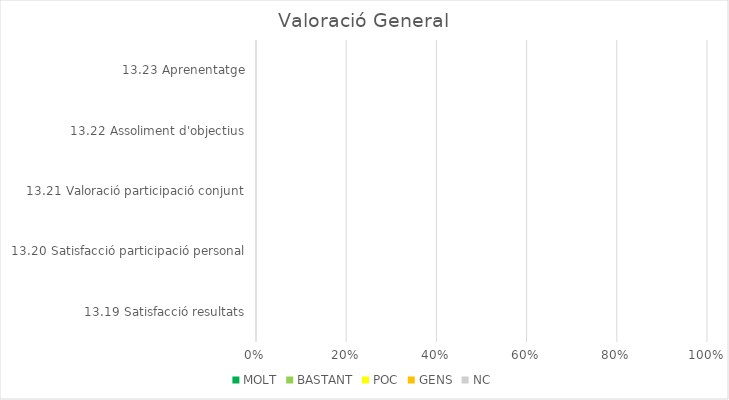
| Category | MOLT | BASTANT | POC | GENS | NC |
|---|---|---|---|---|---|
| 13.19 Satisfacció resultats | 0 | 0 | 0 | 0 | 0 |
| 13.20 Satisfacció participació personal | 0 | 0 | 0 | 0 | 0 |
| 13.21 Valoració participació conjunt | 0 | 0 | 0 | 0 | 0 |
| 13.22 Assoliment d'objectius | 0 | 0 | 0 | 0 | 0 |
| 13.23 Aprenentatge | 0 | 0 | 0 | 0 | 0 |